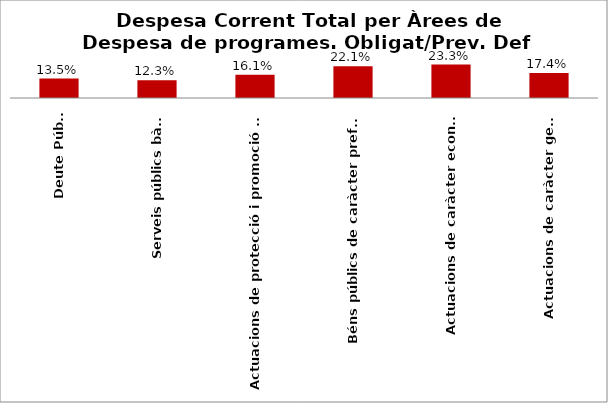
| Category | Series 0 |
|---|---|
| Deute Públic | 0.135 |
| Serveis públics bàsics | 0.123 |
| Actuacions de protecció i promoció social | 0.161 |
| Béns públics de caràcter preferent | 0.221 |
| Actuacions de caràcter econòmic | 0.233 |
| Actuacions de caràcter general | 0.174 |